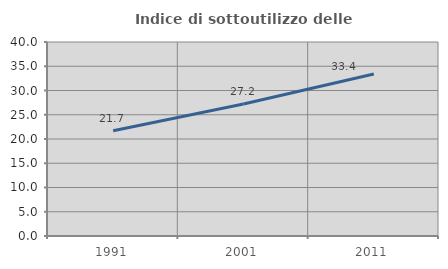
| Category | Indice di sottoutilizzo delle abitazioni  |
|---|---|
| 1991.0 | 21.709 |
| 2001.0 | 27.23 |
| 2011.0 | 33.412 |